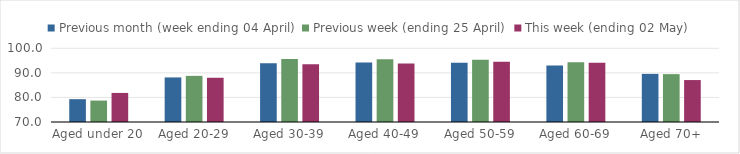
| Category | Previous month (week ending 04 April) | Previous week (ending 25 April) | This week (ending 02 May) |
|---|---|---|---|
| Aged under 20 | 79.284 | 78.72 | 81.825 |
| Aged 20-29 | 88.139 | 88.777 | 88.005 |
| Aged 30-39 | 93.933 | 95.641 | 93.548 |
| Aged 40-49 | 94.252 | 95.5 | 93.833 |
| Aged 50-59 | 94.12 | 95.352 | 94.49 |
| Aged 60-69 | 92.969 | 94.314 | 94.106 |
| Aged 70+ | 89.588 | 89.48 | 87.07 |